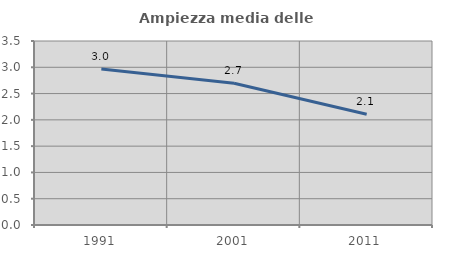
| Category | Ampiezza media delle famiglie |
|---|---|
| 1991.0 | 2.968 |
| 2001.0 | 2.697 |
| 2011.0 | 2.106 |